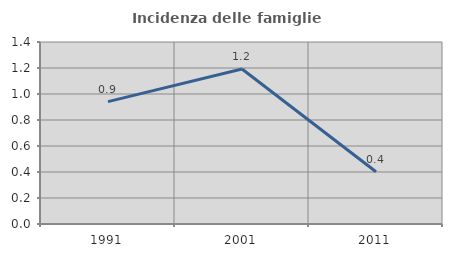
| Category | Incidenza delle famiglie numerose |
|---|---|
| 1991.0 | 0.942 |
| 2001.0 | 1.192 |
| 2011.0 | 0.402 |